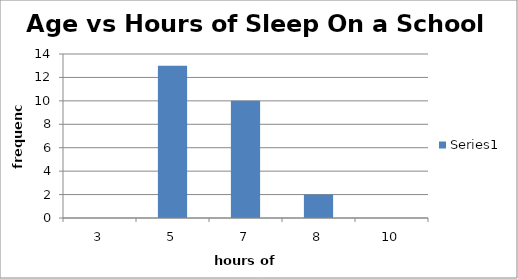
| Category | Series 0 |
|---|---|
| 3.0 | 0 |
| 5.0 | 13 |
| 7.0 | 10 |
| 8.0 | 2 |
| 10.0 | 0 |